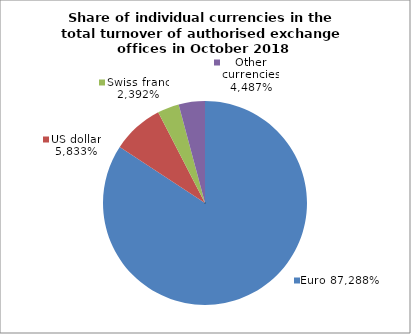
| Category | EUR |
|---|---|
| 0 | 0.843 |
| 1 | 0.082 |
| 2 | 0.034 |
| 3 | 0.042 |